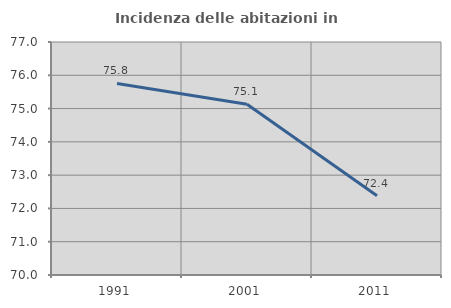
| Category | Incidenza delle abitazioni in proprietà  |
|---|---|
| 1991.0 | 75.754 |
| 2001.0 | 75.129 |
| 2011.0 | 72.381 |